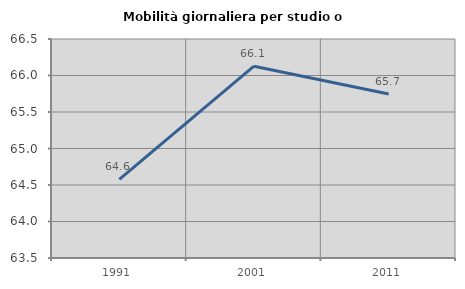
| Category | Mobilità giornaliera per studio o lavoro |
|---|---|
| 1991.0 | 64.576 |
| 2001.0 | 66.128 |
| 2011.0 | 65.745 |